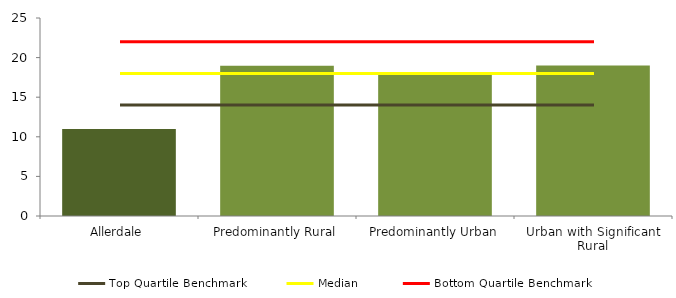
| Category | Series 0 |
|---|---|
| Allerdale | 11 |
| Predominantly Rural | 18.986 |
| Predominantly Urban | 18.147 |
| Urban with Significant Rural | 19 |